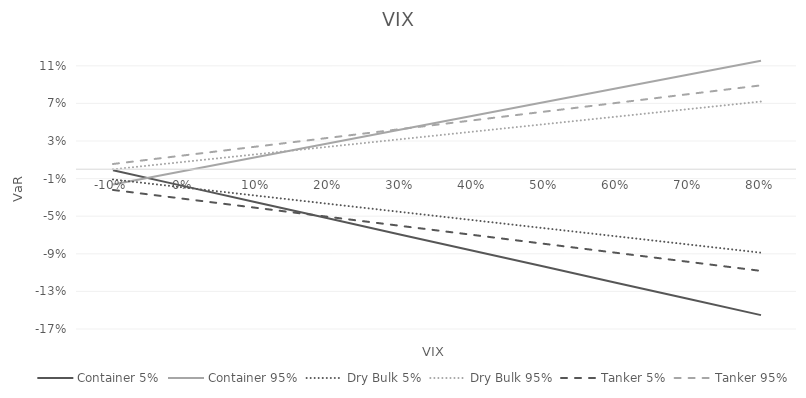
| Category | Container 5% | Container 95% | Dry Bulk 5% | Dry Bulk 95% | Tanker 5% | Tanker 95% |
|---|---|---|---|---|---|---|
| -0.1 | -0.001 | -0.016 | -0.011 | 0 | -0.022 | 0.006 |
| 0.0 | -0.018 | -0.002 | -0.02 | 0.008 | -0.032 | 0.015 |
| 0.1 | -0.035 | 0.013 | -0.028 | 0.016 | -0.041 | 0.024 |
| 0.2 | -0.053 | 0.028 | -0.037 | 0.024 | -0.051 | 0.033 |
| 0.30000000000000004 | -0.07 | 0.042 | -0.046 | 0.032 | -0.06 | 0.043 |
| 0.4 | -0.087 | 0.057 | -0.054 | 0.04 | -0.07 | 0.052 |
| 0.5 | -0.104 | 0.071 | -0.063 | 0.048 | -0.079 | 0.061 |
| 0.6 | -0.121 | 0.086 | -0.072 | 0.056 | -0.089 | 0.071 |
| 0.7 | -0.138 | 0.101 | -0.08 | 0.064 | -0.099 | 0.08 |
| 0.7999999999999999 | -0.155 | 0.115 | -0.089 | 0.072 | -0.108 | 0.089 |